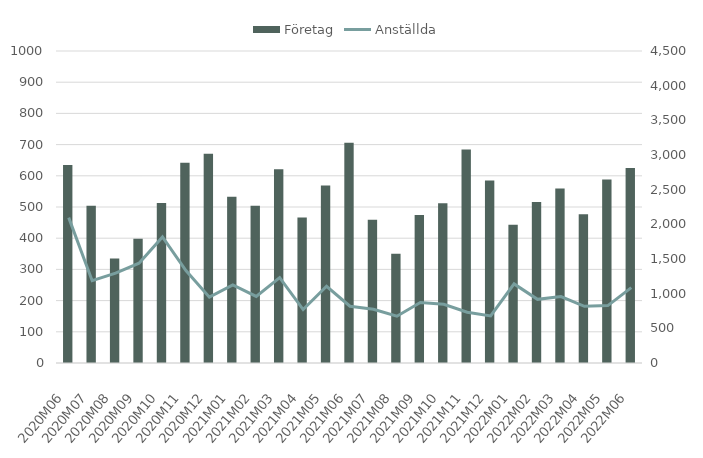
| Category | Företag |
|---|---|
| 2020M06 | 635 |
| 2020M07 | 504 |
| 2020M08 | 335 |
| 2020M09 | 398 |
| 2020M10 | 513 |
| 2020M11 | 642 |
| 2020M12 | 671 |
| 2021M01 | 533 |
| 2021M02 | 504 |
| 2021M03 | 621 |
| 2021M04 | 466 |
| 2021M05 | 569 |
| 2021M06 | 706 |
| 2021M07 | 459 |
| 2021M08 | 350 |
| 2021M09 | 474 |
| 2021M10 | 512 |
| 2021M11 | 684 |
| 2021M12 | 585 |
| 2022M01 | 443 |
| 2022M02 | 516 |
| 2022M03 | 559 |
| 2022M04 | 477 |
| 2022M05 | 588 |
| 2022M06 | 625 |